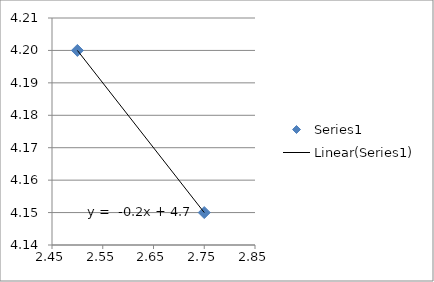
| Category | Series 0 |
|---|---|
| 2.5 | 4.2 |
| 2.75 | 4.15 |